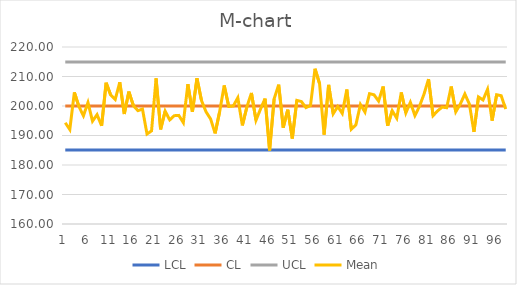
| Category | LCL | CL | UCL | Mean |
|---|---|---|---|---|
| 0 | 185.08 | 200 | 214.92 | 194.326 |
| 1 | 185.08 | 200 | 214.92 | 192.021 |
| 2 | 185.08 | 200 | 214.92 | 204.617 |
| 3 | 185.08 | 200 | 214.92 | 199.856 |
| 4 | 185.08 | 200 | 214.92 | 196.689 |
| 5 | 185.08 | 200 | 214.92 | 201.176 |
| 6 | 185.08 | 200 | 214.92 | 194.865 |
| 7 | 185.08 | 200 | 214.92 | 197.068 |
| 8 | 185.08 | 200 | 214.92 | 193.294 |
| 9 | 185.08 | 200 | 214.92 | 207.884 |
| 10 | 185.08 | 200 | 214.92 | 203.729 |
| 11 | 185.08 | 200 | 214.92 | 202.235 |
| 12 | 185.08 | 200 | 214.92 | 208.031 |
| 13 | 185.08 | 200 | 214.92 | 197.295 |
| 14 | 185.08 | 200 | 214.92 | 204.875 |
| 15 | 185.08 | 200 | 214.92 | 200.132 |
| 16 | 185.08 | 200 | 214.92 | 198.417 |
| 17 | 185.08 | 200 | 214.92 | 198.964 |
| 18 | 185.08 | 200 | 214.92 | 190.511 |
| 19 | 185.08 | 200 | 214.92 | 191.574 |
| 20 | 185.08 | 200 | 214.92 | 209.371 |
| 21 | 185.08 | 200 | 214.92 | 192.06 |
| 22 | 185.08 | 200 | 214.92 | 198.265 |
| 23 | 185.08 | 200 | 214.92 | 195.282 |
| 24 | 185.08 | 200 | 214.92 | 196.722 |
| 25 | 185.08 | 200 | 214.92 | 196.816 |
| 26 | 185.08 | 200 | 214.92 | 194.357 |
| 27 | 185.08 | 200 | 214.92 | 207.393 |
| 28 | 185.08 | 200 | 214.92 | 197.998 |
| 29 | 185.08 | 200 | 214.92 | 209.397 |
| 30 | 185.08 | 200 | 214.92 | 201.855 |
| 31 | 185.08 | 200 | 214.92 | 198.019 |
| 32 | 185.08 | 200 | 214.92 | 195.634 |
| 33 | 185.08 | 200 | 214.92 | 190.712 |
| 34 | 185.08 | 200 | 214.92 | 198.091 |
| 35 | 185.08 | 200 | 214.92 | 206.984 |
| 36 | 185.08 | 200 | 214.92 | 199.837 |
| 37 | 185.08 | 200 | 214.92 | 199.996 |
| 38 | 185.08 | 200 | 214.92 | 202.801 |
| 39 | 185.08 | 200 | 214.92 | 193.418 |
| 40 | 185.08 | 200 | 214.92 | 199.693 |
| 41 | 185.08 | 200 | 214.92 | 204.434 |
| 42 | 185.08 | 200 | 214.92 | 195.184 |
| 43 | 185.08 | 200 | 214.92 | 198.972 |
| 44 | 185.08 | 200 | 214.92 | 202.517 |
| 45 | 185.08 | 200 | 214.92 | 184.935 |
| 46 | 185.08 | 200 | 214.92 | 202.45 |
| 47 | 185.08 | 200 | 214.92 | 207.228 |
| 48 | 185.08 | 200 | 214.92 | 192.676 |
| 49 | 185.08 | 200 | 214.92 | 198.751 |
| 50 | 185.08 | 200 | 214.92 | 189.001 |
| 51 | 185.08 | 200 | 214.92 | 201.935 |
| 52 | 185.08 | 200 | 214.92 | 201.519 |
| 53 | 185.08 | 200 | 214.92 | 199.426 |
| 54 | 185.08 | 200 | 214.92 | 200.144 |
| 55 | 185.08 | 200 | 214.92 | 212.628 |
| 56 | 185.08 | 200 | 214.92 | 207.595 |
| 57 | 185.08 | 200 | 214.92 | 190.324 |
| 58 | 185.08 | 200 | 214.92 | 207.163 |
| 59 | 185.08 | 200 | 214.92 | 197.37 |
| 60 | 185.08 | 200 | 214.92 | 199.826 |
| 61 | 185.08 | 200 | 214.92 | 197.499 |
| 62 | 185.08 | 200 | 214.92 | 205.584 |
| 63 | 185.08 | 200 | 214.92 | 192.127 |
| 64 | 185.08 | 200 | 214.92 | 193.609 |
| 65 | 185.08 | 200 | 214.92 | 200.511 |
| 66 | 185.08 | 200 | 214.92 | 197.936 |
| 67 | 185.08 | 200 | 214.92 | 204.185 |
| 68 | 185.08 | 200 | 214.92 | 203.791 |
| 69 | 185.08 | 200 | 214.92 | 201.676 |
| 70 | 185.08 | 200 | 214.92 | 206.61 |
| 71 | 185.08 | 200 | 214.92 | 193.306 |
| 72 | 185.08 | 200 | 214.92 | 198.396 |
| 73 | 185.08 | 200 | 214.92 | 195.871 |
| 74 | 185.08 | 200 | 214.92 | 204.597 |
| 75 | 185.08 | 200 | 214.92 | 197.664 |
| 76 | 185.08 | 200 | 214.92 | 201.239 |
| 77 | 185.08 | 200 | 214.92 | 196.77 |
| 78 | 185.08 | 200 | 214.92 | 199.886 |
| 79 | 185.08 | 200 | 214.92 | 204.006 |
| 80 | 185.08 | 200 | 214.92 | 209.122 |
| 81 | 185.08 | 200 | 214.92 | 196.729 |
| 82 | 185.08 | 200 | 214.92 | 198.361 |
| 83 | 185.08 | 200 | 214.92 | 199.622 |
| 84 | 185.08 | 200 | 214.92 | 199.422 |
| 85 | 185.08 | 200 | 214.92 | 206.605 |
| 86 | 185.08 | 200 | 214.92 | 198.045 |
| 87 | 185.08 | 200 | 214.92 | 200.666 |
| 88 | 185.08 | 200 | 214.92 | 204.071 |
| 89 | 185.08 | 200 | 214.92 | 200.622 |
| 90 | 185.08 | 200 | 214.92 | 191.214 |
| 91 | 185.08 | 200 | 214.92 | 203.071 |
| 92 | 185.08 | 200 | 214.92 | 202.055 |
| 93 | 185.08 | 200 | 214.92 | 205.661 |
| 94 | 185.08 | 200 | 214.92 | 195.033 |
| 95 | 185.08 | 200 | 214.92 | 203.822 |
| 96 | 185.08 | 200 | 214.92 | 203.484 |
| 97 | 185.08 | 200 | 214.92 | 198.961 |